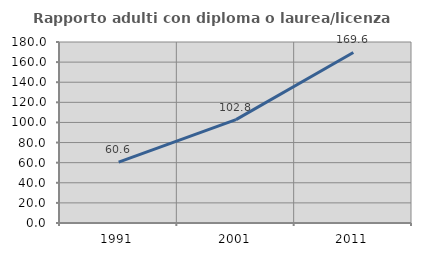
| Category | Rapporto adulti con diploma o laurea/licenza media  |
|---|---|
| 1991.0 | 60.597 |
| 2001.0 | 102.762 |
| 2011.0 | 169.625 |